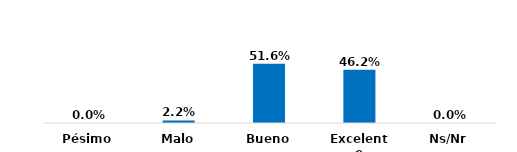
| Category | Series 0 |
|---|---|
| Pésimo | 0 |
| Malo | 0.022 |
| Bueno | 0.516 |
| Excelente | 0.462 |
| Ns/Nr | 0 |